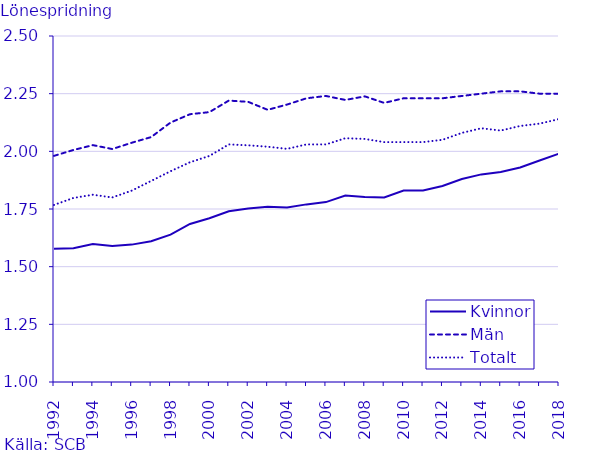
| Category | Kvinnor | Män | Totalt |
|---|---|---|---|
| 1992.0 | 1.578 | 1.98 | 1.768 |
| 1993.0 | 1.58 | 2.006 | 1.798 |
| 1994.0 | 1.598 | 2.027 | 1.812 |
| 1995.0 | 1.59 | 2.01 | 1.8 |
| 1996.0 | 1.596 | 2.037 | 1.83 |
| 1997.0 | 1.61 | 2.062 | 1.871 |
| 1998.0 | 1.639 | 2.125 | 1.914 |
| 1999.0 | 1.685 | 2.161 | 1.953 |
| 2000.0 | 1.71 | 2.17 | 1.98 |
| 2001.0 | 1.74 | 2.22 | 2.03 |
| 2002.0 | 1.752 | 2.214 | 2.026 |
| 2003.0 | 1.76 | 2.18 | 2.02 |
| 2004.0 | 1.756 | 2.203 | 2.011 |
| 2005.0 | 1.77 | 2.23 | 2.03 |
| 2006.0 | 1.78 | 2.24 | 2.03 |
| 2007.0 | 1.808 | 2.223 | 2.057 |
| 2008.0 | 1.802 | 2.238 | 2.054 |
| 2009.0 | 1.8 | 2.21 | 2.04 |
| 2010.0 | 1.83 | 2.23 | 2.04 |
| 2011.0 | 1.83 | 2.23 | 2.04 |
| 2012.0 | 1.85 | 2.23 | 2.05 |
| 2013.0 | 1.88 | 2.24 | 2.08 |
| 2014.0 | 1.9 | 2.25 | 2.1 |
| 2015.0 | 1.91 | 2.26 | 2.09 |
| 2016.0 | 1.93 | 2.26 | 2.11 |
| 2017.0 | 1.96 | 2.25 | 2.12 |
| 2018.0 | 1.99 | 2.25 | 2.14 |